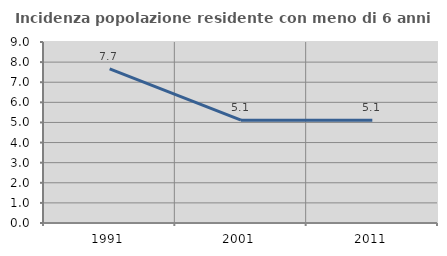
| Category | Incidenza popolazione residente con meno di 6 anni |
|---|---|
| 1991.0 | 7.667 |
| 2001.0 | 5.115 |
| 2011.0 | 5.109 |